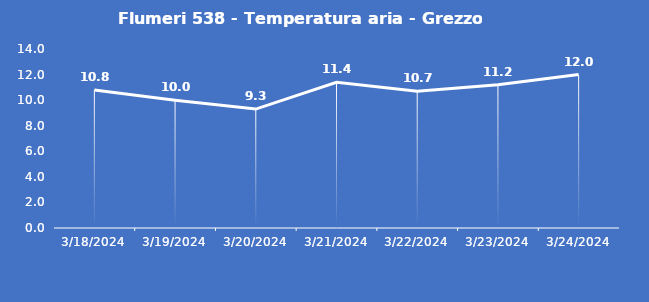
| Category | Flumeri 538 - Temperatura aria - Grezzo (°C) |
|---|---|
| 3/18/24 | 10.8 |
| 3/19/24 | 10 |
| 3/20/24 | 9.3 |
| 3/21/24 | 11.4 |
| 3/22/24 | 10.7 |
| 3/23/24 | 11.2 |
| 3/24/24 | 12 |